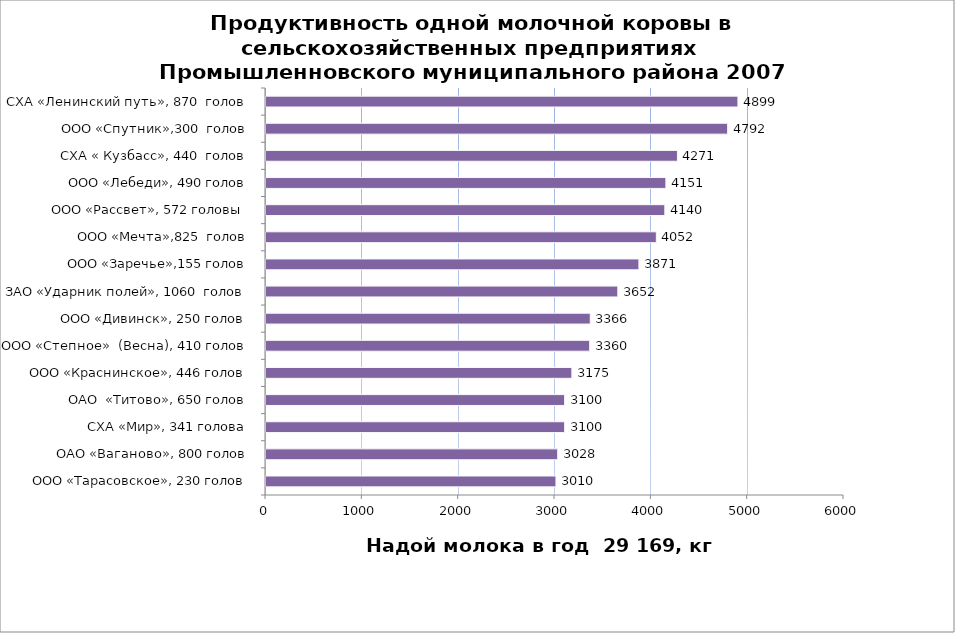
| Category | Series 0 |
|---|---|
| ООО «Тарасовское», 230 голов | 3010 |
| ОАО «Ваганово», 800 голов | 3028 |
| СХА «Мир», 341 голова | 3100 |
| ОАО  «Титово», 650 голов | 3100 |
| ООО «Краснинское», 446 голов | 3175 |
| ООО «Степное»  (Весна), 410 голов | 3360 |
| ООО «Дивинск», 250 голов | 3366 |
| ЗАО «Ударник полей», 1060  голов | 3652 |
| ООО «Заречье»,155 голов | 3871 |
| ООО «Мечта»,825  голов | 4052 |
| ООО «Рассвет», 572 головы  | 4140 |
| ООО «Лебеди», 490 голов | 4151 |
| СХА « Кузбасс», 440  голов | 4271 |
| ООО «Спутник»,300  голов | 4792 |
| СХА «Ленинский путь», 870  голов | 4899 |